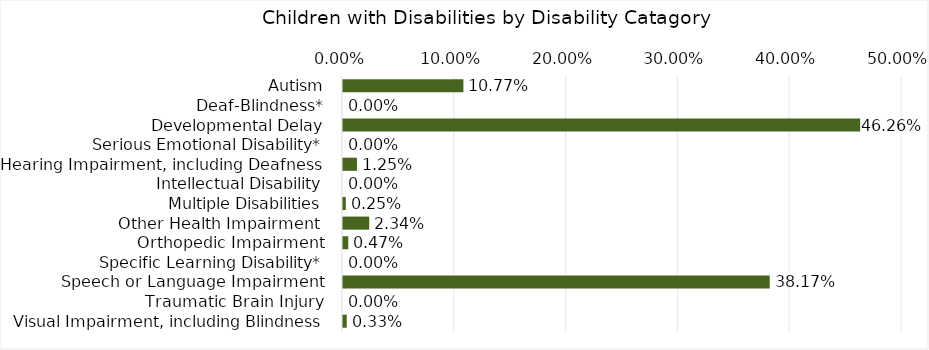
| Category | Percentage |
|---|---|
| Autism | 0.108 |
| Deaf-Blindness* | 0 |
| Developmental Delay | 0.463 |
| Serious Emotional Disability* | 0 |
| Hearing Impairment, including Deafness | 0.012 |
| Intellectual Disability | 0 |
| Multiple Disabilities | 0.003 |
| Other Health Impairment  | 0.023 |
| Orthopedic Impairment | 0.005 |
| Specific Learning Disability* | 0 |
| Speech or Language Impairment | 0.382 |
| Traumatic Brain Injury | 0 |
| Visual Impairment, including Blindness | 0.003 |